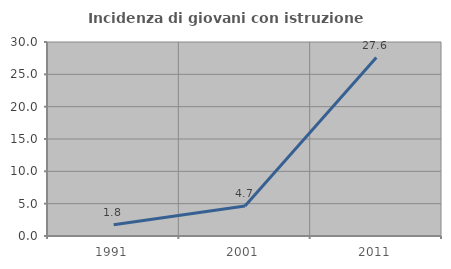
| Category | Incidenza di giovani con istruzione universitaria |
|---|---|
| 1991.0 | 1.754 |
| 2001.0 | 4.651 |
| 2011.0 | 27.586 |